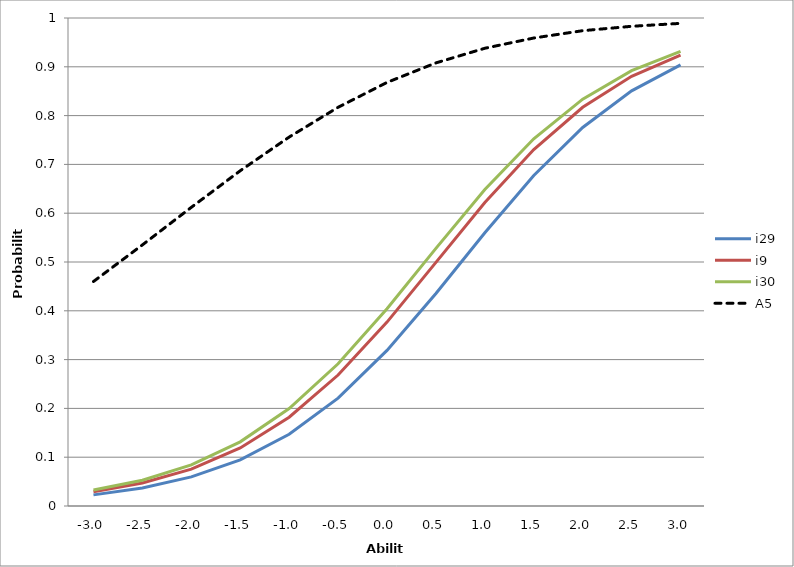
| Category | i29 | i9 | i30 | A5 |
|---|---|---|---|---|
| -3.0 | 0.023 | 0.029 | 0.033 | 0.46 |
| -2.5 | 0.037 | 0.047 | 0.053 | 0.535 |
| -2.0 | 0.06 | 0.076 | 0.084 | 0.612 |
| -1.5 | 0.095 | 0.119 | 0.131 | 0.687 |
| -1.0 | 0.147 | 0.182 | 0.2 | 0.756 |
| -0.5 | 0.221 | 0.268 | 0.292 | 0.817 |
| 0.0 | 0.319 | 0.377 | 0.404 | 0.868 |
| 0.5 | 0.436 | 0.499 | 0.528 | 0.908 |
| 1.0 | 0.56 | 0.622 | 0.648 | 0.938 |
| 1.5 | 0.677 | 0.73 | 0.753 | 0.959 |
| 2.0 | 0.776 | 0.817 | 0.834 | 0.974 |
| 2.5 | 0.851 | 0.88 | 0.892 | 0.983 |
| 3.0 | 0.904 | 0.924 | 0.932 | 0.989 |